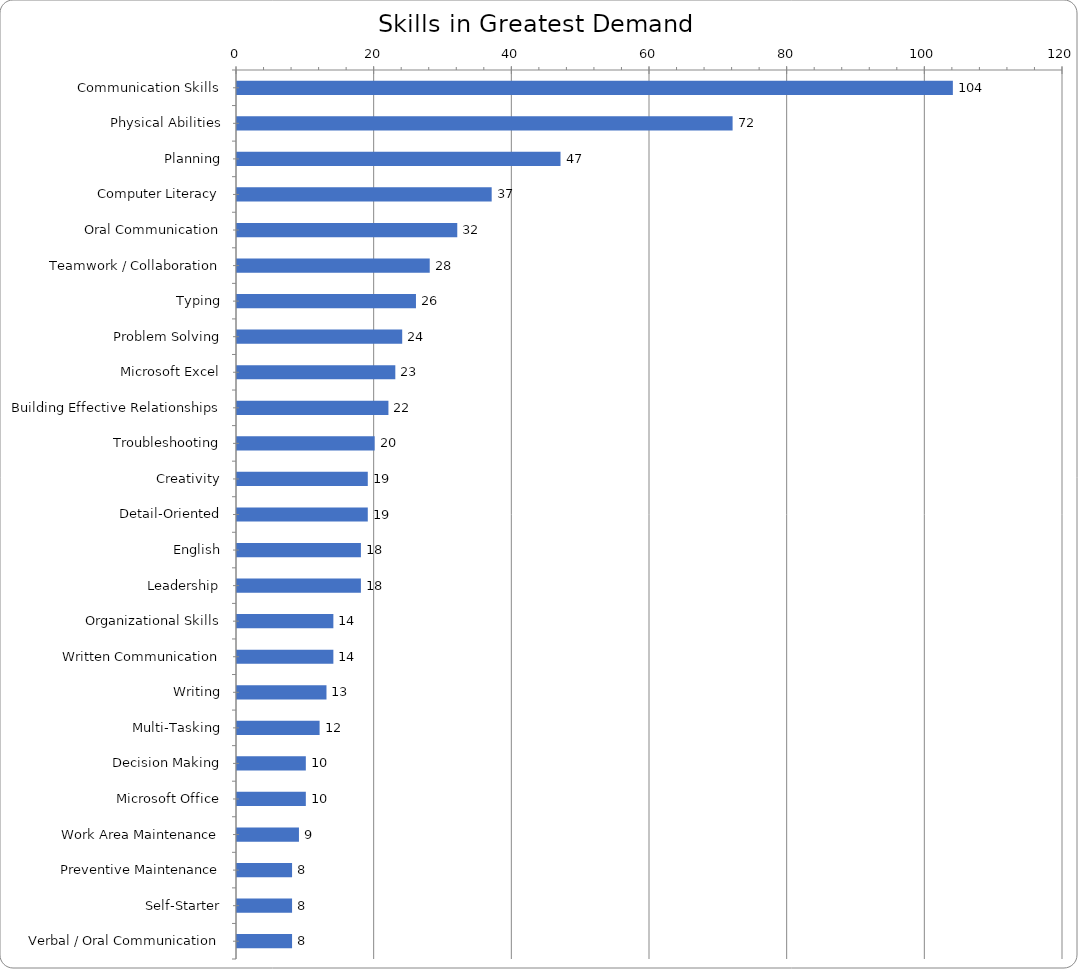
| Category | Series 0 |
|---|---|
| Communication Skills | 104 |
| Physical Abilities | 72 |
| Planning | 47 |
| Computer Literacy | 37 |
| Oral Communication | 32 |
| Teamwork / Collaboration | 28 |
| Typing | 26 |
| Problem Solving | 24 |
| Microsoft Excel | 23 |
| Building Effective Relationships | 22 |
| Troubleshooting | 20 |
| Creativity | 19 |
| Detail-Oriented | 19 |
| English | 18 |
| Leadership | 18 |
| Organizational Skills | 14 |
| Written Communication | 14 |
| Writing | 13 |
| Multi-Tasking | 12 |
| Decision Making | 10 |
| Microsoft Office | 10 |
| Work Area Maintenance | 9 |
| Preventive Maintenance | 8 |
| Self-Starter | 8 |
| Verbal / Oral Communication | 8 |